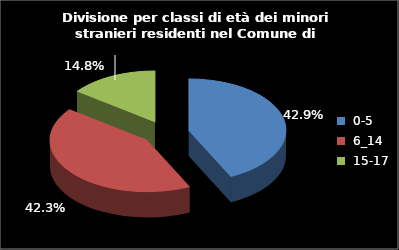
| Category | Series 0 |
|---|---|
| 0-5 | 84 |
| 6_14 | 83 |
| 15-17 | 29 |